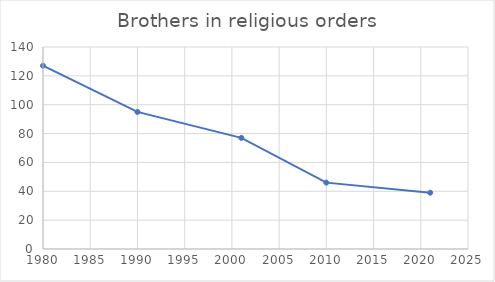
| Category | Brothers in religious orders |
|---|---|
| 1980.0 | 127 |
| 1990.0 | 95 |
| 2001.0 | 77 |
| 2010.0 | 46 |
| 2021.0 | 39 |